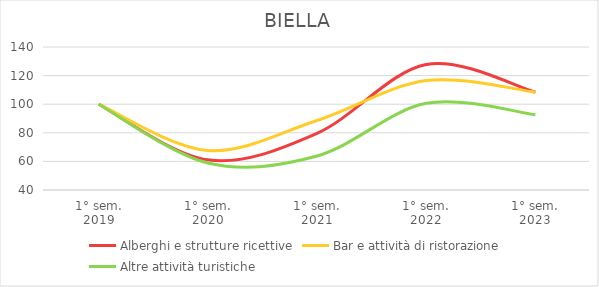
| Category | Alberghi e strutture ricettive | Bar e attività di ristorazione | Altre attività turistiche |
|---|---|---|---|
| 1° sem.
2019 | 100 | 100 | 100 |
| 1° sem.
2020 | 61.111 | 67.634 | 58.896 |
| 1° sem.
2021 | 79.63 | 88.577 | 63.804 |
| 1° sem.
2022 | 127.778 | 116.5 | 100.613 |
| 1° sem.
2023 | 108.333 | 108.432 | 92.638 |